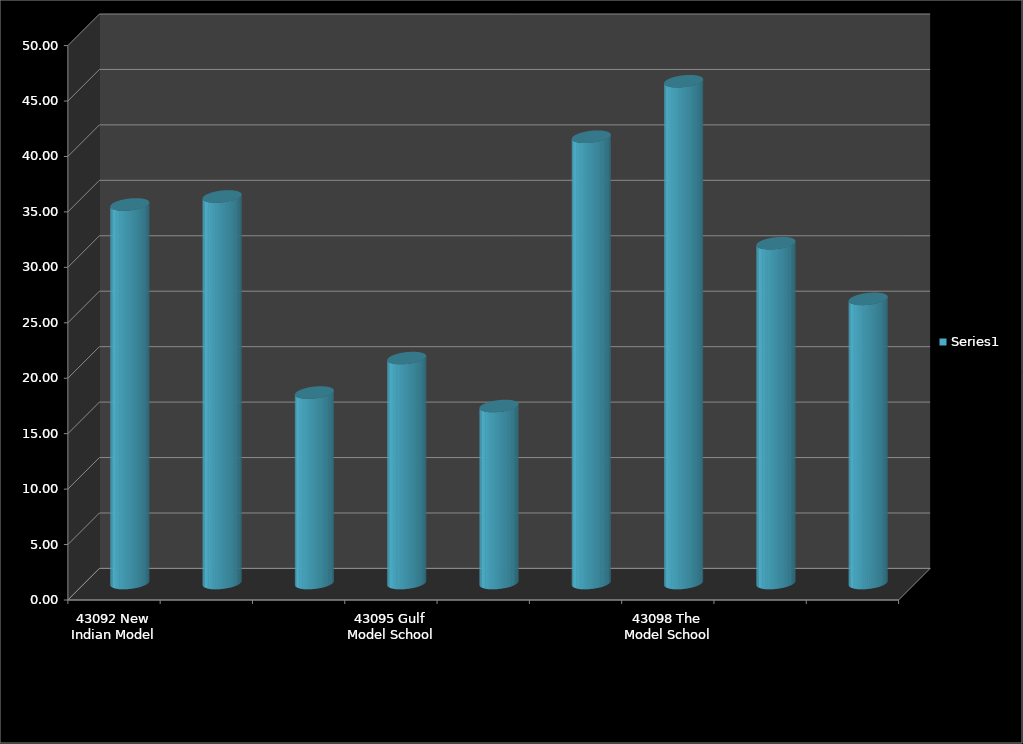
| Category | Series 0 |
|---|---|
| 43092 New Indian Model School Dubai UAE | 34.138 |
| 43093 The New Indian Model School Sharjah | 34.857 |
| 43094 New Indian H S S Ras Al Khaimah, U.A.E | 17.174 |
| 43095 Gulf Model School Dubai UAE | 20.286 |
| 43096 The English School, Umm Al Quwain | 15.957 |
| 43097 The Indian School Fujairah UAE | 40.244 |
| 43098 The Model School Abu Dhabi UAE | 45.25 |
| 43102 New Indian Model School  Al Ain,  UAE | 30.645 |
| 43103 The New Indian School Umm Al Quwain  | 25.625 |